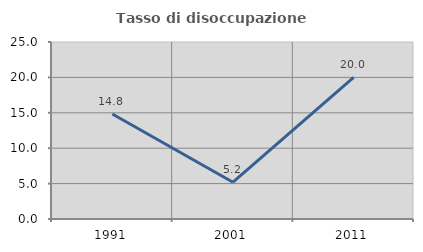
| Category | Tasso di disoccupazione giovanile  |
|---|---|
| 1991.0 | 14.831 |
| 2001.0 | 5.195 |
| 2011.0 | 20 |